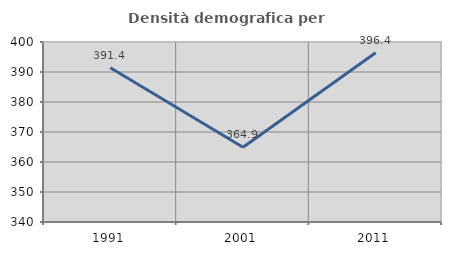
| Category | Densità demografica |
|---|---|
| 1991.0 | 391.435 |
| 2001.0 | 364.913 |
| 2011.0 | 396.388 |